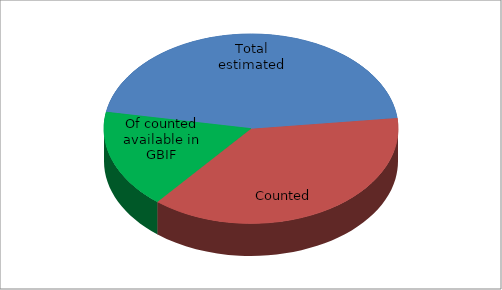
| Category | Series 0 |
|---|---|
| Total estimated | 250 |
| Counted | 207.7 |
| Of counted available in GBIF | 92.6 |